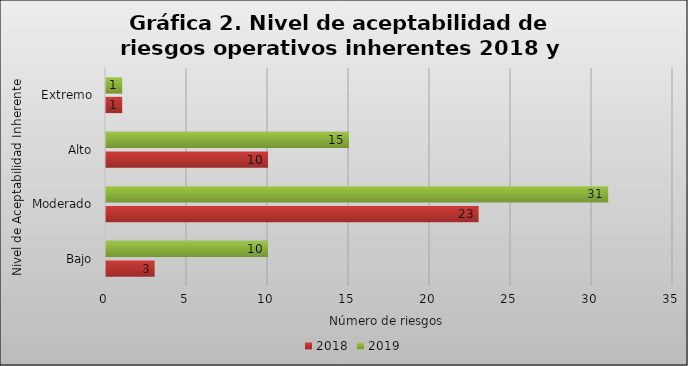
| Category | 2018 | 2019 |
|---|---|---|
| Bajo | 3 | 10 |
| Moderado | 23 | 31 |
| Alto | 10 | 15 |
| Extremo | 1 | 1 |